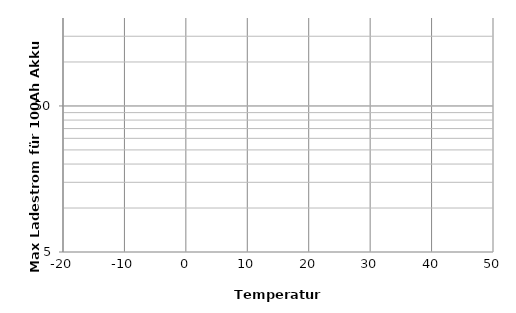
| Category | Series 0 |
|---|---|
| -20.0 | 5 |
| -10.0 | 11.111 |
| 0.0 | 22.727 |
| 15.0 | 62.5 |
| 25.0 | 100 |
| 45.0 | 200 |